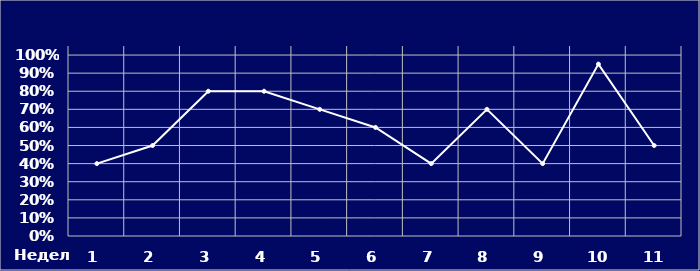
| Category | Series 0 |
|---|---|
| 0 | 0.4 |
| 1 | 0.5 |
| 2 | 0.8 |
| 3 | 0.8 |
| 4 | 0.7 |
| 5 | 0.6 |
| 6 | 0.4 |
| 7 | 0.7 |
| 8 | 0.4 |
| 9 | 0.95 |
| 10 | 0.5 |